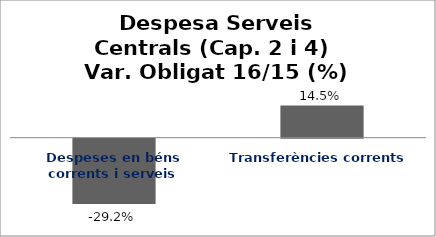
| Category | Series 0 |
|---|---|
| Despeses en béns corrents i serveis | -0.292 |
| Transferències corrents | 0.145 |